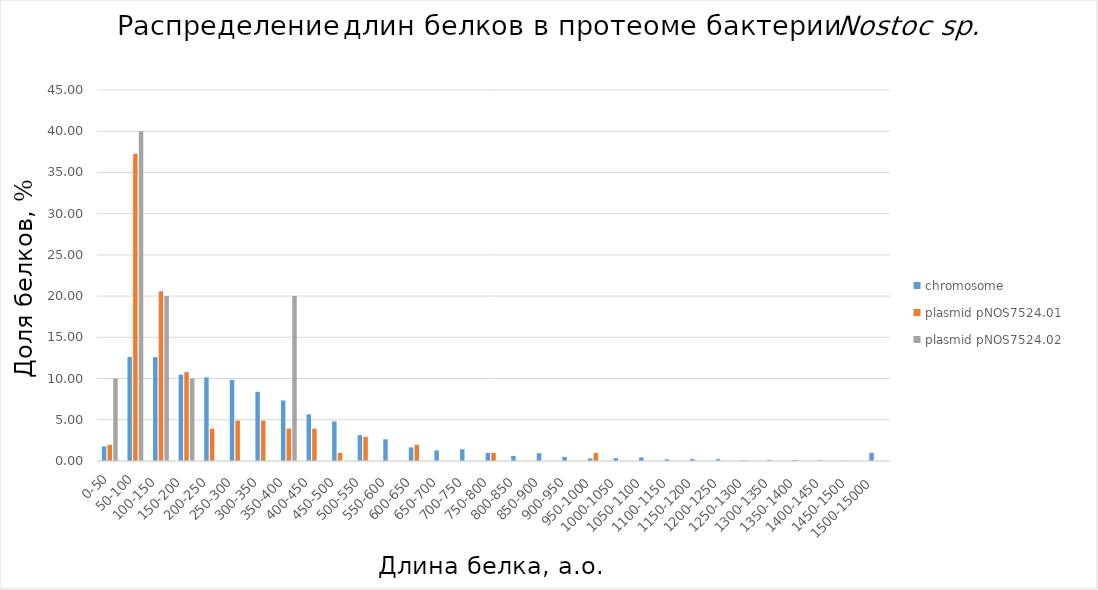
| Category | chromosome | plasmid pNOS7524.01 | plasmid pNOS7524.02 |
|---|---|---|---|
| 0-50 | 1.769 | 1.961 | 10 |
| 50-100 | 12.608 | 37.255 | 40 |
| 100-150 | 12.608 | 20.588 | 20 |
| 150-200 | 10.482 | 10.784 | 10 |
| 200-250 | 10.143 | 3.922 | 0 |
| 250-300 | 9.823 | 4.902 | 0 |
| 300-350 | 8.393 | 4.902 | 0 |
| 350-400 | 7.339 | 3.922 | 20 |
| 400-450 | 5.664 | 3.922 | 0 |
| 450-500 | 4.799 | 0.98 | 0 |
| 500-550 | 3.143 | 2.941 | 0 |
| 550-600 | 2.635 | 0 | 0 |
| 600-650 | 1.656 | 1.961 | 0 |
| 650-700 | 1.28 | 0 | 0 |
| 700-750 | 1.411 | 0 | 0 |
| 750-800 | 0.979 | 0.98 | 0 |
| 800-850 | 0.621 | 0 | 0 |
| 850-900 | 0.941 | 0 | 0 |
| 900-950 | 0.489 | 0 | 0 |
| 950-1000 | 0.32 | 0.98 | 0 |
| 1000-1050 | 0.358 | 0 | 0 |
| 1050-1100 | 0.433 | 0 | 0 |
| 1100-1150 | 0.207 | 0 | 0 |
| 1150-1200 | 0.226 | 0 | 0 |
| 1200-1250 | 0.226 | 0 | 0 |
| 1250-1300 | 0.075 | 0 | 0 |
| 1300-1350 | 0.132 | 0 | 0 |
| 1350-1400 | 0.132 | 0 | 0 |
| 1400-1450 | 0.075 | 0 | 0 |
| 1450-1500 | 0.038 | 0 | 0 |
| 1500-15000 | 0.997 | 0 | 0 |